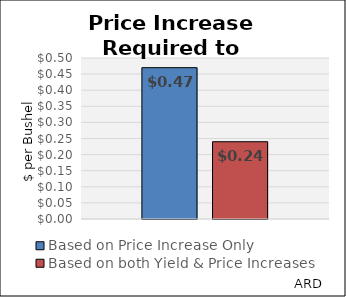
| Category | Based on Price Increase Only | Based on both Yield & Price Increases |
|---|---|---|
|  | 0.47 | 0.24 |